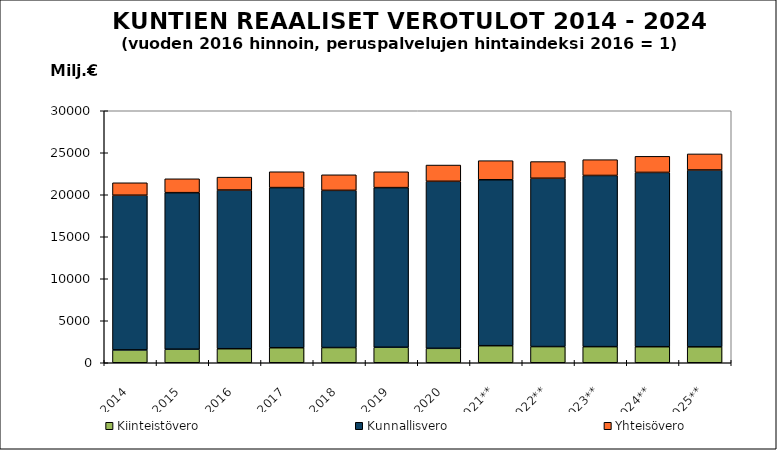
| Category | Kiinteistövero | Kunnallisvero | Yhteisövero |
|---|---|---|---|
| 2014 | 1530.151 | 18415.782 | 1479.005 |
| 2015 | 1613.607 | 18634.72 | 1651.359 |
| 2016 | 1669.703 | 18890.563 | 1537.872 |
| 2017 | 1789.239 | 19064.268 | 1884.667 |
| 2018 | 1809.209 | 18714.38 | 1852.755 |
| 2019 | 1847.54 | 19002.13 | 1885.594 |
| 2020 | 1718.131 | 19884.816 | 1934.106 |
| 2021** | 2029.778 | 19756.507 | 2271.418 |
| 2022** | 1926.683 | 20039.407 | 1983.911 |
| 2023** | 1917.635 | 20379.577 | 1880.035 |
| 2024** | 1907.487 | 20750.867 | 1916.747 |
| 2025** | 1896.308 | 21050.839 | 1914.541 |